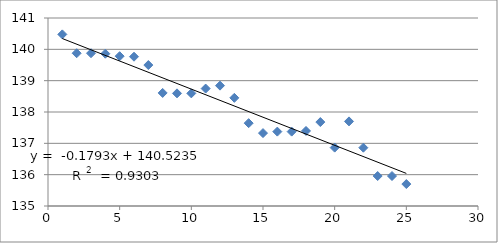
| Category | Series 0 |
|---|---|
| 1.0 | 140.477 |
| 2.0 | 139.876 |
| 3.0 | 139.876 |
| 4.0 | 139.86 |
| 5.0 | 139.782 |
| 6.0 | 139.765 |
| 7.0 | 139.498 |
| 8.0 | 138.609 |
| 9.0 | 138.595 |
| 10.0 | 138.595 |
| 11.0 | 138.748 |
| 12.0 | 138.841 |
| 13.0 | 138.452 |
| 14.0 | 137.644 |
| 15.0 | 137.326 |
| 16.0 | 137.374 |
| 17.0 | 137.374 |
| 18.0 | 137.395 |
| 19.0 | 137.679 |
| 20.0 | 136.864 |
| 21.0 | 137.7 |
| 22.0 | 136.861 |
| 23.0 | 135.957 |
| 24.0 | 135.957 |
| 25.0 | 135.7 |